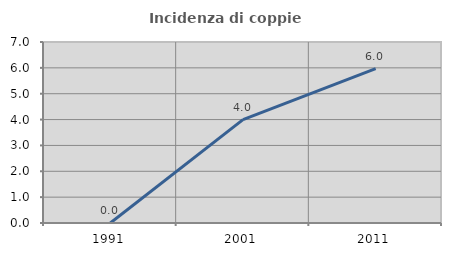
| Category | Incidenza di coppie miste |
|---|---|
| 1991.0 | 0 |
| 2001.0 | 4 |
| 2011.0 | 5.97 |